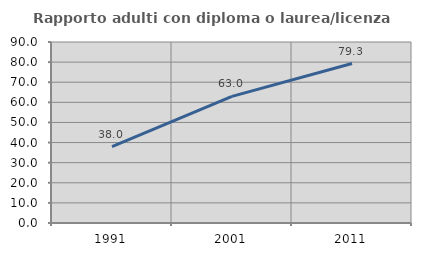
| Category | Rapporto adulti con diploma o laurea/licenza media  |
|---|---|
| 1991.0 | 38.009 |
| 2001.0 | 62.971 |
| 2011.0 | 79.277 |